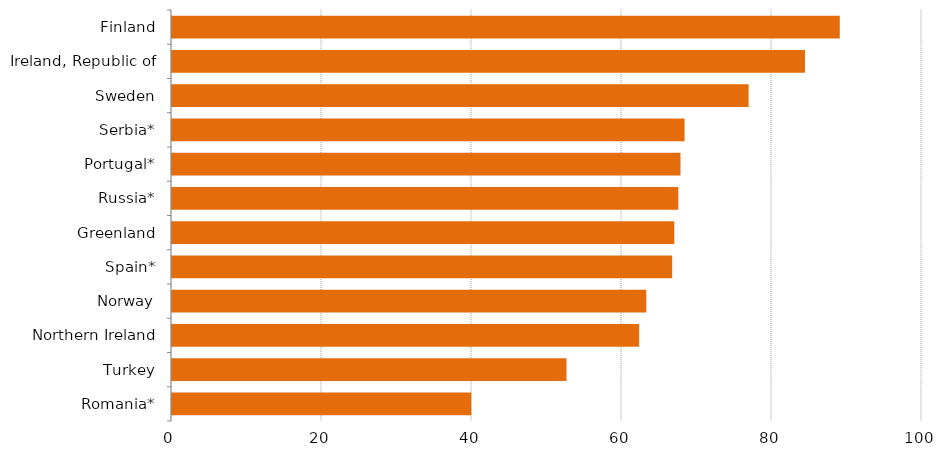
| Category | Score |
|---|---|
| Romania* | 39.91 |
| Turkey | 52.6 |
| Northern Ireland | 62.29 |
| Norway | 63.24 |
| Spain* | 66.69 |
| Greenland | 66.97 |
| Russia* | 67.51 |
| Portugal* | 67.8 |
| Serbia* | 68.34 |
| Sweden | 76.88 |
| Ireland, Republic of | 84.4 |
| Finland | 89.04 |